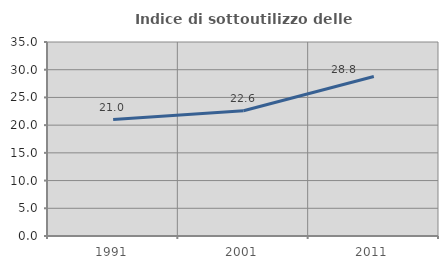
| Category | Indice di sottoutilizzo delle abitazioni  |
|---|---|
| 1991.0 | 21.002 |
| 2001.0 | 22.602 |
| 2011.0 | 28.78 |